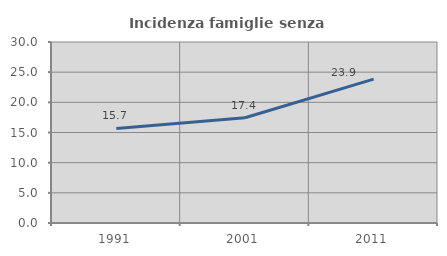
| Category | Incidenza famiglie senza nuclei |
|---|---|
| 1991.0 | 15.674 |
| 2001.0 | 17.438 |
| 2011.0 | 23.851 |